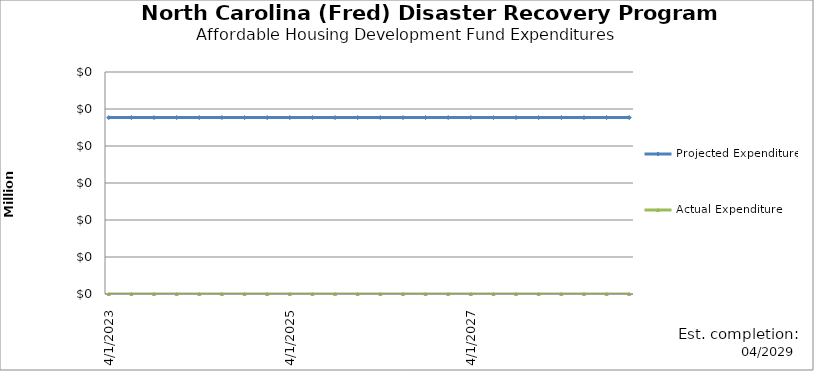
| Category | Projected Expenditures | Actual Expenditure |
|---|---|---|
| 4/1/23 | 238400 | 0 |
| 7/1/23 | 238400 | 0 |
| 10/1/23 | 238400 | 0 |
| 1/1/24 | 238400 | 0 |
| 4/1/24 | 238400 | 0 |
| 7/1/24 | 238400 | 0 |
| 10/1/24 | 238400 | 0 |
| 1/1/25 | 238400 | 0 |
| 4/1/25 | 238400 | 0 |
| 7/1/25 | 238400 | 0 |
| 10/1/25 | 238400 | 0 |
| 1/1/26 | 238400 | 0 |
| 4/1/26 | 238400 | 0 |
| 7/1/26 | 238400 | 0 |
| 10/1/26 | 238400 | 0 |
| 1/1/27 | 238400 | 0 |
| 4/1/27 | 238400 | 0 |
| 7/1/27 | 238400 | 0 |
| 10/1/27 | 238400 | 0 |
| 1/1/28 | 238400 | 0 |
| 4/1/28 | 238400 | 0 |
| 7/1/28 | 238400 | 0 |
| 10/1/28 | 238400 | 0 |
| 1/1/29 | 238400 | 0 |